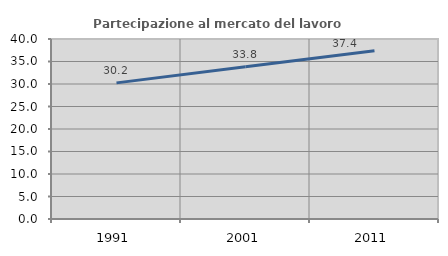
| Category | Partecipazione al mercato del lavoro  femminile |
|---|---|
| 1991.0 | 30.248 |
| 2001.0 | 33.849 |
| 2011.0 | 37.396 |